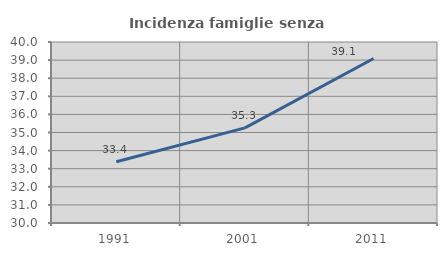
| Category | Incidenza famiglie senza nuclei |
|---|---|
| 1991.0 | 33.384 |
| 2001.0 | 35.254 |
| 2011.0 | 39.091 |